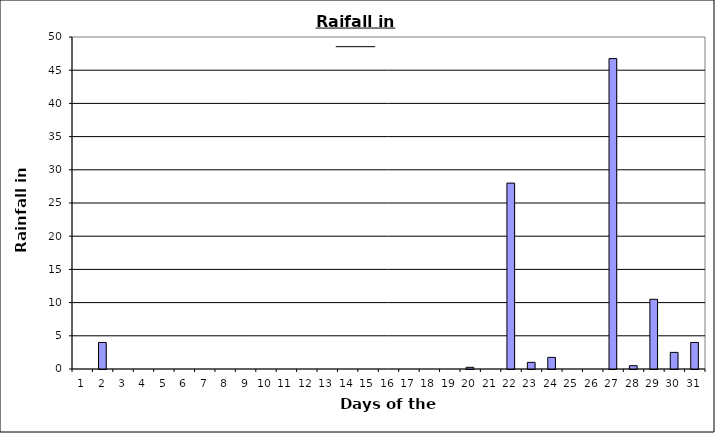
| Category | Rain |
|---|---|
| 0 | 0 |
| 1 | 4 |
| 2 | 0 |
| 3 | 0 |
| 4 | 0 |
| 5 | 0 |
| 6 | 0 |
| 7 | 0 |
| 8 | 0 |
| 9 | 0 |
| 10 | 0 |
| 11 | 0 |
| 12 | 0 |
| 13 | 0 |
| 14 | 0 |
| 15 | 0 |
| 16 | 0 |
| 17 | 0 |
| 18 | 0 |
| 19 | 0.25 |
| 20 | 0 |
| 21 | 28 |
| 22 | 1 |
| 23 | 1.75 |
| 24 | 0 |
| 25 | 0 |
| 26 | 46.75 |
| 27 | 0.5 |
| 28 | 10.5 |
| 29 | 2.5 |
| 30 | 4 |